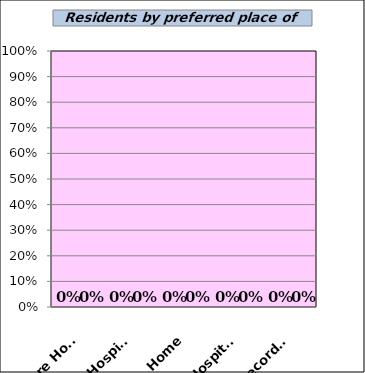
| Category | Pre-Programme | Post-Programme |
|---|---|---|
| Care Home | 0 | 0 |
| Hospice | 0 | 0 |
| Home | 0 | 0 |
| Hospital | 0 | 0 |
| Unrecorded | 0 | 0 |